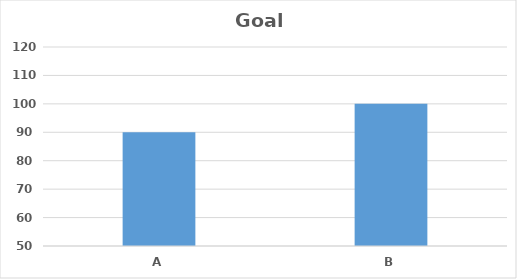
| Category | Goal |
|---|---|
| A | 90 |
| B | 100 |